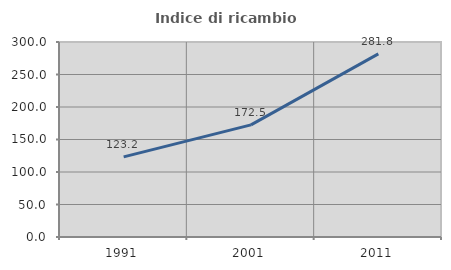
| Category | Indice di ricambio occupazionale  |
|---|---|
| 1991.0 | 123.214 |
| 2001.0 | 172.5 |
| 2011.0 | 281.818 |